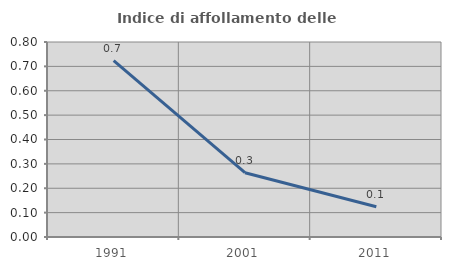
| Category | Indice di affollamento delle abitazioni  |
|---|---|
| 1991.0 | 0.724 |
| 2001.0 | 0.264 |
| 2011.0 | 0.124 |